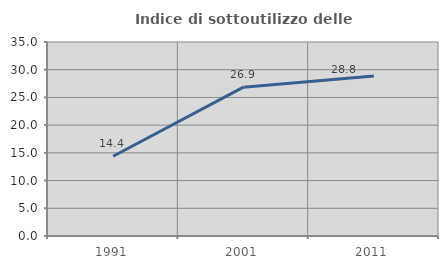
| Category | Indice di sottoutilizzo delle abitazioni  |
|---|---|
| 1991.0 | 14.379 |
| 2001.0 | 26.857 |
| 2011.0 | 28.846 |